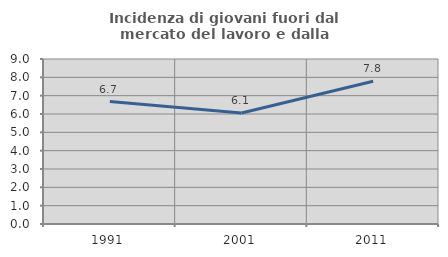
| Category | Incidenza di giovani fuori dal mercato del lavoro e dalla formazione  |
|---|---|
| 1991.0 | 6.68 |
| 2001.0 | 6.054 |
| 2011.0 | 7.785 |